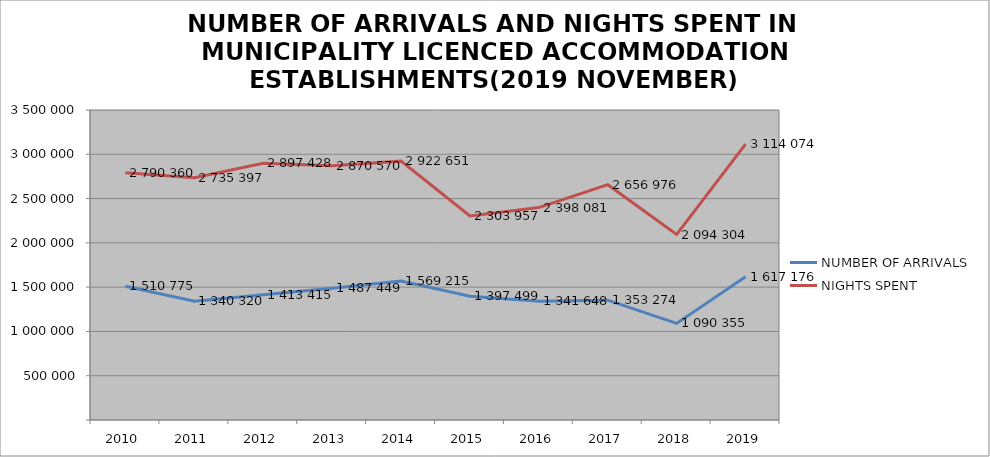
| Category | NUMBER OF ARRIVALS | NIGHTS SPENT |
|---|---|---|
| 2010 | 1510775 | 2790360 |
| 2011 | 1340320 | 2735397 |
| 2012 | 1413415 | 2897428 |
| 2013 | 1487449 | 2870570 |
| 2014 | 1569215 | 2922651 |
| 2015 | 1397499 | 2303957 |
| 2016 | 1341648 | 2398081 |
| 2017 | 1353274 | 2656976 |
| 2018 | 1090355 | 2094304 |
| 2019 | 1617176 | 3114074 |